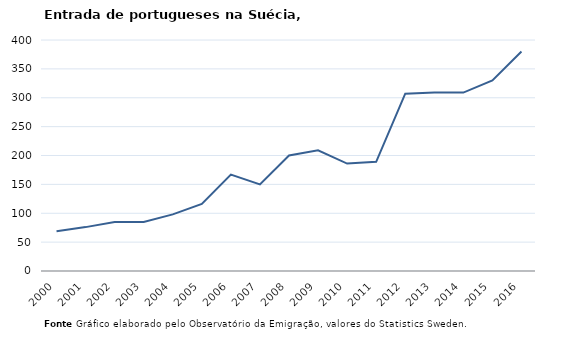
| Category | Entradas |
|---|---|
| 2000.0 | 69 |
| 2001.0 | 76 |
| 2002.0 | 85 |
| 2003.0 | 85 |
| 2004.0 | 98 |
| 2005.0 | 116 |
| 2006.0 | 167 |
| 2007.0 | 150 |
| 2008.0 | 200 |
| 2009.0 | 209 |
| 2010.0 | 186 |
| 2011.0 | 189 |
| 2012.0 | 307 |
| 2013.0 | 309 |
| 2014.0 | 309 |
| 2015.0 | 330 |
| 2016.0 | 380 |